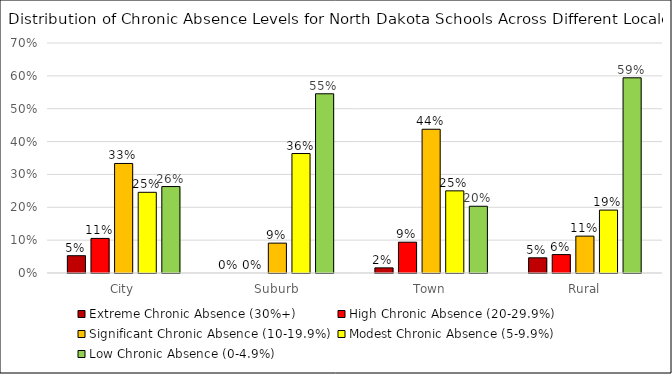
| Category | Extreme Chronic Absence (30%+) | High Chronic Absence (20-29.9%) | Significant Chronic Absence (10-19.9%) | Modest Chronic Absence (5-9.9%) | Low Chronic Absence (0-4.9%) |
|---|---|---|---|---|---|
| City | 0.053 | 0.105 | 0.333 | 0.246 | 0.263 |
| Suburb | 0 | 0 | 0.091 | 0.364 | 0.545 |
| Town | 0.016 | 0.094 | 0.438 | 0.25 | 0.203 |
| Rural | 0.046 | 0.056 | 0.112 | 0.191 | 0.594 |